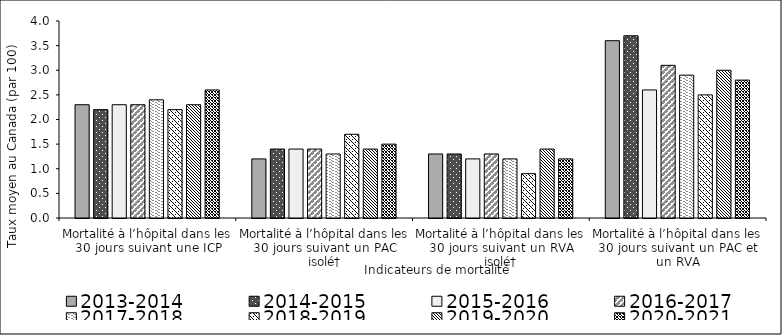
| Category | 2013-2014 | 2014-2015 | 2015-2016 | 2016-2017 | 2017-2018 | 2018-2019 | 2019-2020 | 2020-2021 |
|---|---|---|---|---|---|---|---|---|
| Mortalité à l’hôpital dans les 30 jours suivant une ICP | 2.3 | 2.2 | 2.3 | 2.3 | 2.4 | 2.2 | 2.3 | 2.6 |
| Mortalité à l’hôpital dans les 30 jours suivant un PAC isolé† | 1.2 | 1.4 | 1.4 | 1.4 | 1.3 | 1.7 | 1.4 | 1.5 |
| Mortalité à l’hôpital dans les 30 jours suivant un RVA isolé† | 1.3 | 1.3 | 1.2 | 1.3 | 1.2 | 0.9 | 1.4 | 1.2 |
| Mortalité à l’hôpital dans les 30 jours suivant un PAC et un RVA | 3.6 | 3.7 | 2.6 | 3.1 | 2.9 | 2.5 | 3 | 2.8 |